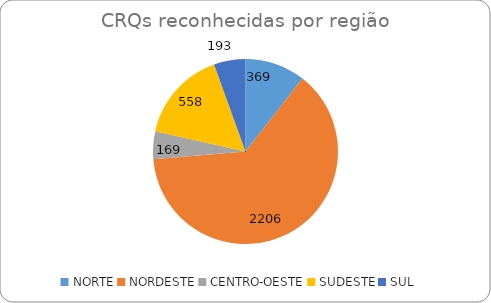
| Category | Series 0 |
|---|---|
| NORTE | 369 |
| NORDESTE | 2206 |
| CENTRO-OESTE | 169 |
| SUDESTE | 558 |
| SUL | 193 |